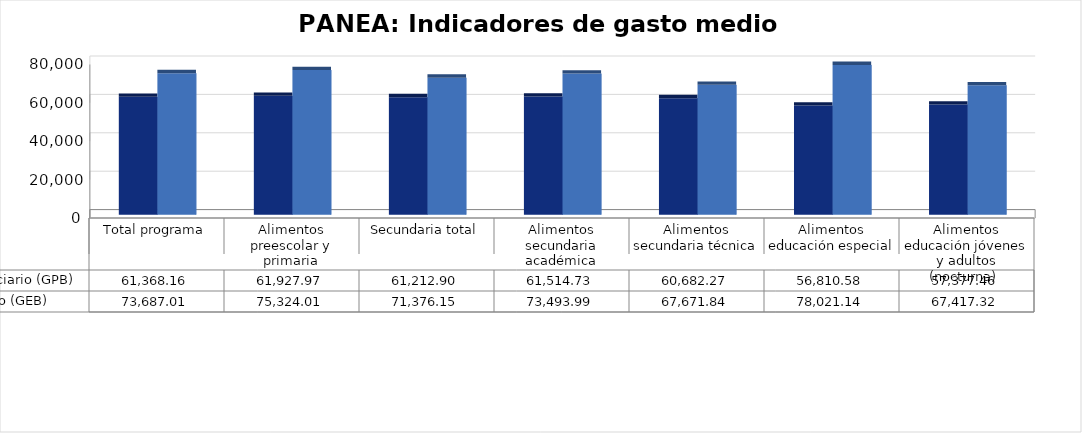
| Category | Gasto programado acumulado por beneficiario (GPB)  | Gasto efectivo acumulado por beneficiario (GEB)  |
|---|---|---|
| Total programa | 61368.16 | 73687.007 |
| Alimentos preescolar y primaria | 61927.965 | 75324.015 |
| Secundaria total | 61212.903 | 71376.146 |
| Alimentos secundaria académica | 61514.728 | 73493.992 |
| Alimentos secundaria técnica | 60682.267 | 67671.835 |
| Alimentos educación especial | 56810.582 | 78021.143 |
| Alimentos educación jóvenes y adultos (nocturna)  | 57377.459 | 67417.315 |